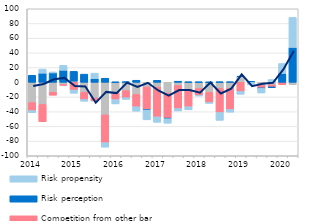
| Category | Costs of funding | Competition from other banks | Risk perception | Risk propensity |
|---|---|---|---|---|
| 2014.0 | -27.614 | -10.883 | 9.484 | -2.931 |
| nan | -30.154 | -23.565 | 12.376 | 5.591 |
| nan | -13.58 | -4.04 | 12.739 | 1.322 |
| nan | -3.194 | -0.943 | 16.324 | 6.815 |
| 2015.0 | 1.584 | -10.634 | 13.285 | -4.309 |
| nan | -13.709 | -9.748 | 11.117 | -2.291 |
| nan | -21.32 | -4.036 | 5.049 | 7.435 |
| nan | -44.371 | -37.787 | 5.514 | -6.068 |
| 2016.0 | -13.683 | -9.865 | 0.112 | -5.896 |
| nan | -11.339 | -9.602 | 0.723 | -2.332 |
| nan | -16.54 | -16.708 | 2.765 | -6.073 |
| nan | -6.439 | -30.804 | -0.484 | -13.396 |
| 2017.0 | -6.563 | -40.484 | 2.656 | -7.434 |
| nan | -14.708 | -34.121 | -0.712 | -6.144 |
| nan | -4.365 | -31.359 | 1.462 | -3.307 |
| nan | -9.63 | -23.589 | 0.436 | -4.267 |
| 2018.0 | -8.401 | -9.465 | 0.383 | -0.758 |
| nan | -13.817 | -13.719 | 0.033 | -1.188 |
| nan | -8.391 | -32.723 | 0.518 | -10.656 |
| nan | -8.386 | -28.581 | 0.546 | -3.682 |
| 2019.0 | 7.614 | -12.529 | 0.567 | -3.764 |
| nan | -0.003 | 0 | 1.352 | -3.594 |
| nan | -3.529 | -4.583 | -0.182 | -6.275 |
| nan | -3.387 | -3.387 | -0.185 | 3.746 |
| 2020.0 | 0 | -3.33 | 12.033 | 13.516 |
| nan | -3.256 | 0 | 47.43 | 40.823 |